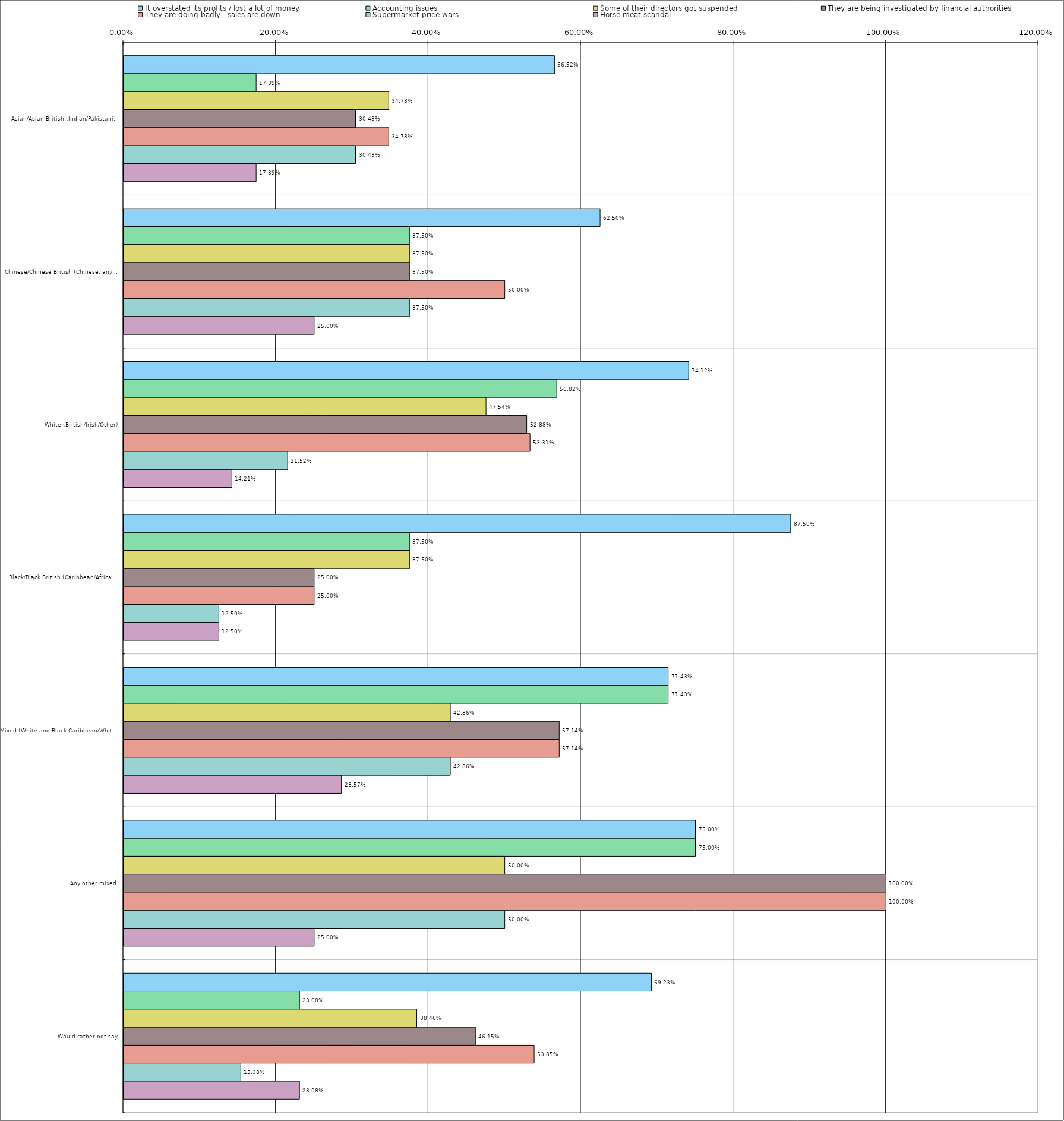
| Category | It overstated its profits / lost a lot of money | Accounting issues | Some of their directors got suspended | They are being investigated by financial authorities | They are doing badly - sales are down | Supermarket price wars | Horse-meat scandal |
|---|---|---|---|---|---|---|---|
| 0 | 0.565 | 0.174 | 0.348 | 0.304 | 0.348 | 0.304 | 0.174 |
| 1 | 0.625 | 0.375 | 0.375 | 0.375 | 0.5 | 0.375 | 0.25 |
| 2 | 0.741 | 0.568 | 0.475 | 0.529 | 0.533 | 0.215 | 0.142 |
| 3 | 0.875 | 0.375 | 0.375 | 0.25 | 0.25 | 0.125 | 0.125 |
| 4 | 0.714 | 0.714 | 0.429 | 0.571 | 0.571 | 0.429 | 0.286 |
| 5 | 0.75 | 0.75 | 0.5 | 1 | 1 | 0.5 | 0.25 |
| 6 | 0.692 | 0.231 | 0.385 | 0.462 | 0.538 | 0.154 | 0.231 |